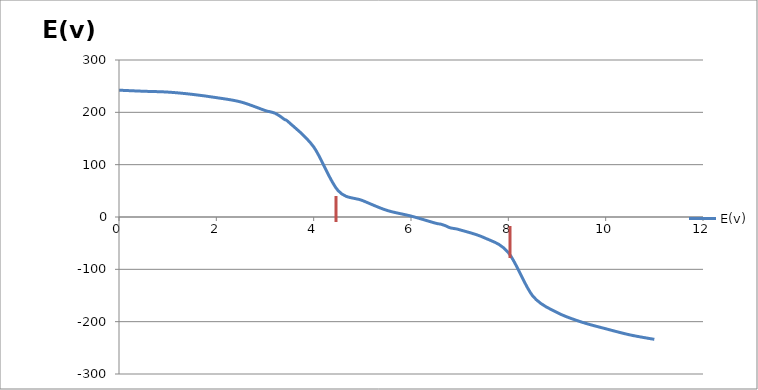
| Category | E(v) |
|---|---|
| 0.0 | 242.3 |
| 0.5 | 240.3 |
| 1.0 | 238.7 |
| 1.5 | 234.4 |
| 2.0 | 228.1 |
| 2.5 | 219.9 |
| 3.0 | 203.6 |
| 3.1 | 201.2 |
| 3.2 | 198.5 |
| 3.3 | 193.2 |
| 3.4 | 186.4 |
| 3.5 | 180.2 |
| 4.0 | 134 |
| 4.5 | 50.6 |
| 5.0 | 31.6 |
| 5.5 | 12.8 |
| 6.0 | 1.8 |
| 6.5 | -11.7 |
| 6.6 | -13.4 |
| 6.7 | -16.4 |
| 6.8 | -20.5 |
| 6.9 | -22.3 |
| 7.0 | -24.4 |
| 7.5 | -39.4 |
| 8.0 | -68 |
| 8.5 | -150.7 |
| 9.0 | -182.4 |
| 9.5 | -200.6 |
| 10.0 | -213.5 |
| 10.5 | -225.3 |
| 11.0 | -233.8 |